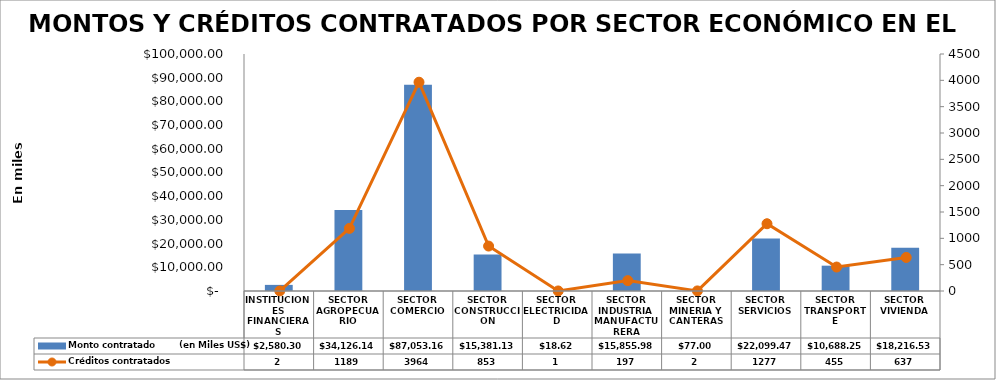
| Category | Monto contratado        (en Miles US$) |
|---|---|
| INSTITUCIONES FINANCIERAS | 2580.304 |
| SECTOR AGROPECUARIO | 34126.138 |
| SECTOR COMERCIO | 87053.16 |
| SECTOR CONSTRUCCION | 15381.131 |
| SECTOR ELECTRICIDAD | 18.621 |
| SECTOR INDUSTRIA MANUFACTURERA | 15855.979 |
| SECTOR MINERIA Y CANTERAS | 77 |
| SECTOR SERVICIOS | 22099.47 |
| SECTOR TRANSPORTE | 10688.254 |
| SECTOR VIVIENDA | 18216.526 |